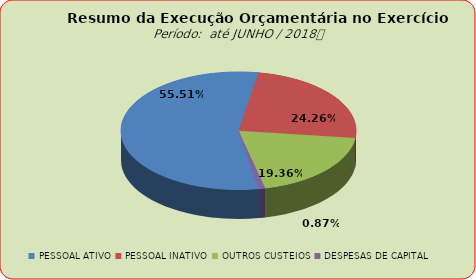
| Category | Series 0 |
|---|---|
| PESSOAL ATIVO | 76710994.1 |
| PESSOAL INATIVO | 33524478.17 |
| OUTROS CUSTEIOS | 26755254.98 |
| DESPESAS DE CAPITAL | 1205529.87 |